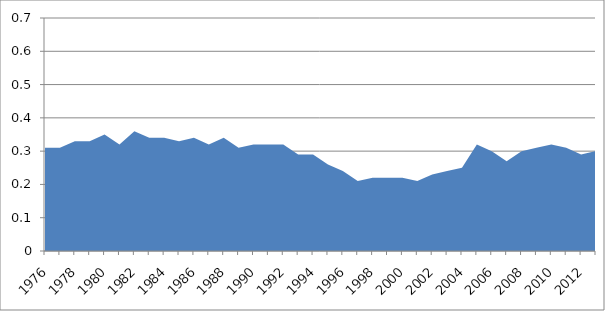
| Category | 0.3 |
|---|---|
| 1976 | 0.31 |
| 1977 | 0.31 |
| 1978 | 0.33 |
| 1979 | 0.33 |
| 1980 | 0.35 |
| 1981 | 0.32 |
| 1982 | 0.36 |
| 1983 | 0.34 |
| 1984 | 0.34 |
| 1985 | 0.33 |
| 1986 | 0.34 |
| 1987 | 0.32 |
| 1988 | 0.34 |
| 1989 | 0.31 |
| 1990 | 0.32 |
| 1991 | 0.32 |
| 1992 | 0.32 |
| 1993 | 0.29 |
| 1994 | 0.29 |
| 1995 | 0.26 |
| 1996 | 0.24 |
| 1997 | 0.21 |
| 1998 | 0.22 |
| 1999 | 0.22 |
| 2000 | 0.22 |
| 2001 | 0.21 |
| 2002 | 0.23 |
| 2003 | 0.24 |
| 2004 | 0.25 |
| 2005 | 0.32 |
| 2006 | 0.3 |
| 2007 | 0.27 |
| 2008 | 0.3 |
| 2009 | 0.31 |
| 2010 | 0.32 |
| 2011 | 0.31 |
| 2012 | 0.29 |
| 2013 | 0.3 |